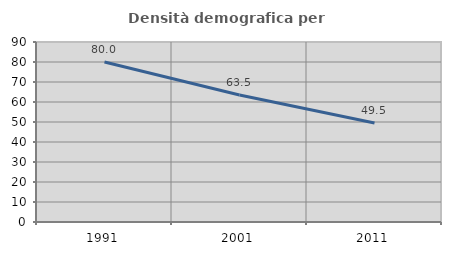
| Category | Densità demografica |
|---|---|
| 1991.0 | 79.96 |
| 2001.0 | 63.522 |
| 2011.0 | 49.524 |